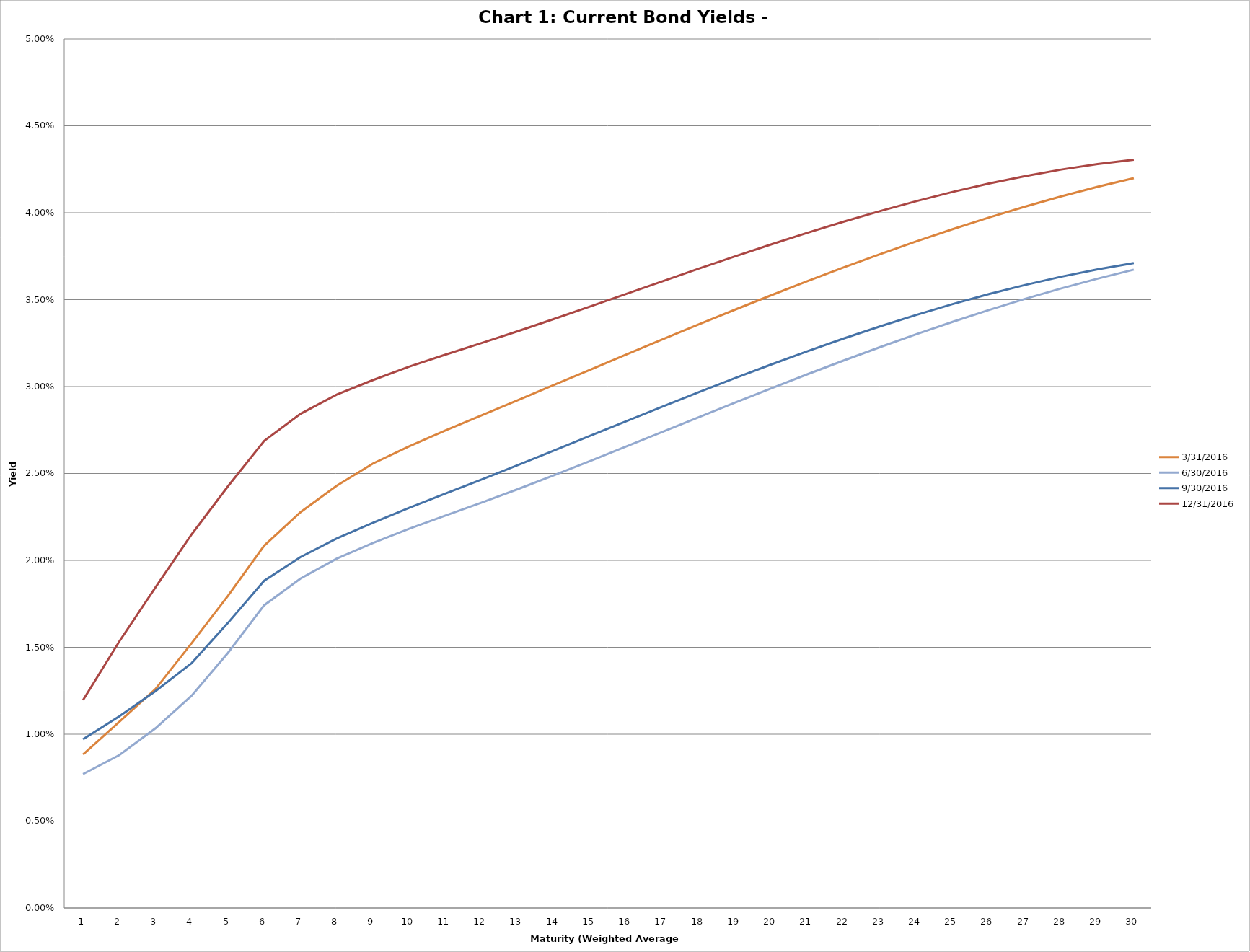
| Category | 3/31/2016 | 6/30/2016 | 9/30/2016 | 12/31/2016 |
|---|---|---|---|---|
| 0 | 0.009 | 0.008 | 0.01 | 0.012 |
| 1 | 0.011 | 0.009 | 0.011 | 0.015 |
| 2 | 0.013 | 0.01 | 0.012 | 0.018 |
| 3 | 0.015 | 0.012 | 0.014 | 0.022 |
| 4 | 0.018 | 0.015 | 0.016 | 0.024 |
| 5 | 0.021 | 0.017 | 0.019 | 0.027 |
| 6 | 0.023 | 0.019 | 0.02 | 0.028 |
| 7 | 0.024 | 0.02 | 0.021 | 0.03 |
| 8 | 0.026 | 0.021 | 0.022 | 0.03 |
| 9 | 0.027 | 0.022 | 0.023 | 0.031 |
| 10 | 0.027 | 0.023 | 0.024 | 0.032 |
| 11 | 0.028 | 0.023 | 0.025 | 0.033 |
| 12 | 0.029 | 0.024 | 0.025 | 0.033 |
| 13 | 0.03 | 0.025 | 0.026 | 0.034 |
| 14 | 0.031 | 0.026 | 0.027 | 0.035 |
| 15 | 0.032 | 0.027 | 0.028 | 0.035 |
| 16 | 0.033 | 0.027 | 0.029 | 0.036 |
| 17 | 0.034 | 0.028 | 0.03 | 0.037 |
| 18 | 0.034 | 0.029 | 0.03 | 0.037 |
| 19 | 0.035 | 0.03 | 0.031 | 0.038 |
| 20 | 0.036 | 0.031 | 0.032 | 0.039 |
| 21 | 0.037 | 0.032 | 0.033 | 0.039 |
| 22 | 0.038 | 0.032 | 0.033 | 0.04 |
| 23 | 0.038 | 0.033 | 0.034 | 0.041 |
| 24 | 0.039 | 0.034 | 0.035 | 0.041 |
| 25 | 0.04 | 0.034 | 0.035 | 0.042 |
| 26 | 0.04 | 0.035 | 0.036 | 0.042 |
| 27 | 0.041 | 0.036 | 0.036 | 0.042 |
| 28 | 0.041 | 0.036 | 0.037 | 0.043 |
| 29 | 0.042 | 0.037 | 0.037 | 0.043 |